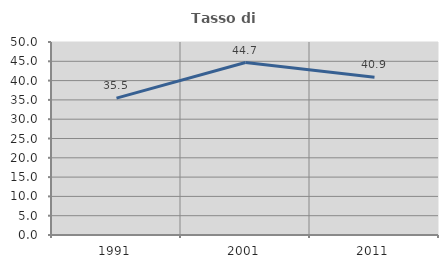
| Category | Tasso di occupazione   |
|---|---|
| 1991.0 | 35.473 |
| 2001.0 | 44.689 |
| 2011.0 | 40.893 |